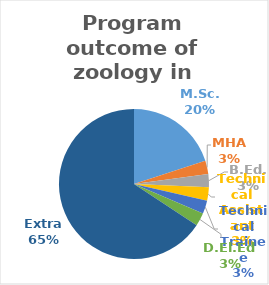
| Category | Series 0 |
|---|---|
| M.Sc. | 7 |
| MHA | 1 |
| B.Ed. | 1 |
| Technical Assistant | 1 |
| Technical Trainee | 1 |
| D.El.Ed | 1 |
| Extra | 23 |